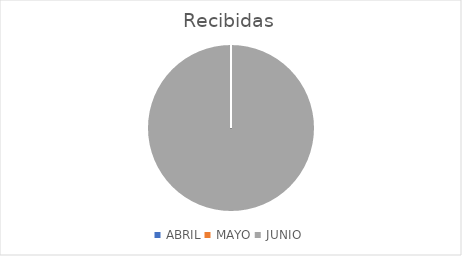
| Category | Recibidas |
|---|---|
| ABRIL | 0 |
| MAYO | 0 |
| JUNIO | 1 |